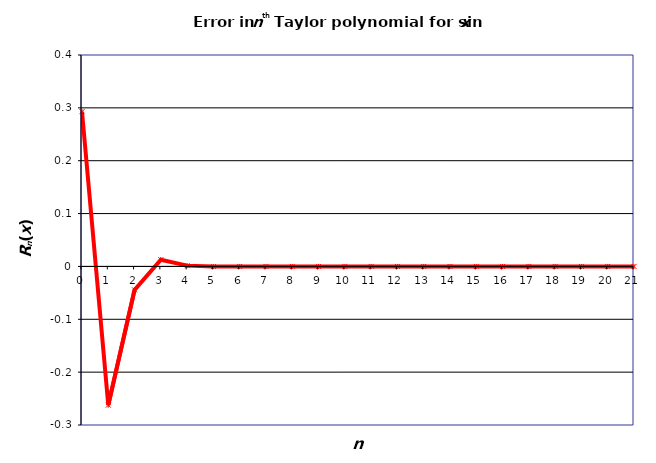
| Category | Rn(x) |
|---|---|
| 0.0 | 0.293 |
| 1.0 | -0.262 |
| 2.0 | -0.044 |
| 3.0 | 0.013 |
| 4.0 | 0.002 |
| 5.0 | 0 |
| 6.0 | 0 |
| 7.0 | 0 |
| 8.0 | 0 |
| 9.0 | 0 |
| 10.0 | 0 |
| 11.0 | 0 |
| 12.0 | 0 |
| 13.0 | 0 |
| 14.0 | 0 |
| 15.0 | 0 |
| 16.0 | 0 |
| 17.0 | 0 |
| 18.0 | 0 |
| 19.0 | 0 |
| 20.0 | 0 |
| 21.0 | 0 |